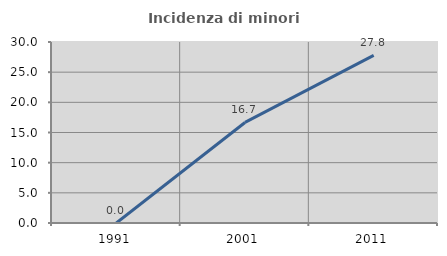
| Category | Incidenza di minori stranieri |
|---|---|
| 1991.0 | 0 |
| 2001.0 | 16.667 |
| 2011.0 | 27.778 |